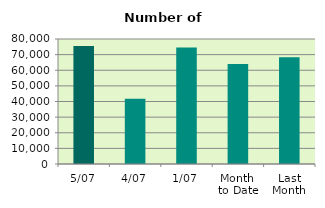
| Category | Series 0 |
|---|---|
| 5/07 | 75550 |
| 4/07 | 41822 |
| 1/07 | 74602 |
| Month 
to Date | 63991.333 |
| Last
Month | 68392.182 |